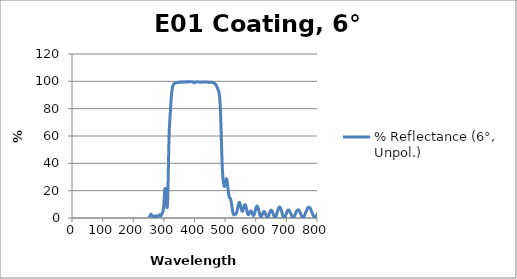
| Category | % Reflectance (6°, Unpol.) |
|---|---|
| 2500.0 | 4.356 |
| 2499.0 | 4.413 |
| 2498.0 | 4.459 |
| 2497.0 | 4.504 |
| 2496.0 | 4.55 |
| 2495.0 | 4.595 |
| 2494.0 | 4.642 |
| 2493.0 | 4.689 |
| 2492.0 | 4.738 |
| 2491.0 | 4.788 |
| 2490.0 | 4.834 |
| 2489.0 | 4.885 |
| 2488.0 | 4.934 |
| 2487.0 | 4.983 |
| 2486.0 | 5.035 |
| 2485.0 | 5.088 |
| 2484.0 | 5.137 |
| 2483.0 | 5.187 |
| 2482.0 | 5.238 |
| 2481.0 | 5.289 |
| 2480.0 | 5.342 |
| 2479.0 | 5.395 |
| 2478.0 | 5.446 |
| 2477.0 | 5.499 |
| 2476.0 | 5.551 |
| 2475.0 | 5.604 |
| 2474.0 | 5.654 |
| 2473.0 | 5.71 |
| 2472.0 | 5.762 |
| 2471.0 | 5.814 |
| 2470.0 | 5.866 |
| 2469.0 | 5.922 |
| 2468.0 | 5.971 |
| 2467.0 | 6.026 |
| 2466.0 | 6.08 |
| 2465.0 | 6.133 |
| 2464.0 | 6.186 |
| 2463.0 | 6.239 |
| 2462.0 | 6.29 |
| 2461.0 | 6.346 |
| 2460.0 | 6.398 |
| 2459.0 | 6.452 |
| 2458.0 | 6.504 |
| 2457.0 | 6.557 |
| 2456.0 | 6.61 |
| 2455.0 | 6.662 |
| 2454.0 | 6.715 |
| 2453.0 | 6.768 |
| 2452.0 | 6.82 |
| 2451.0 | 6.873 |
| 2450.0 | 6.924 |
| 2449.0 | 6.973 |
| 2448.0 | 7.027 |
| 2447.0 | 7.079 |
| 2446.0 | 7.127 |
| 2445.0 | 7.177 |
| 2444.0 | 7.227 |
| 2443.0 | 7.277 |
| 2442.0 | 7.328 |
| 2441.0 | 7.378 |
| 2440.0 | 7.425 |
| 2439.0 | 7.474 |
| 2438.0 | 7.521 |
| 2437.0 | 7.568 |
| 2436.0 | 7.616 |
| 2435.0 | 7.664 |
| 2434.0 | 7.709 |
| 2433.0 | 7.756 |
| 2432.0 | 7.8 |
| 2431.0 | 7.847 |
| 2430.0 | 7.888 |
| 2429.0 | 7.932 |
| 2428.0 | 7.976 |
| 2427.0 | 8.018 |
| 2426.0 | 8.061 |
| 2425.0 | 8.104 |
| 2424.0 | 8.142 |
| 2423.0 | 8.185 |
| 2422.0 | 8.225 |
| 2421.0 | 8.263 |
| 2420.0 | 8.305 |
| 2419.0 | 8.341 |
| 2418.0 | 8.378 |
| 2417.0 | 8.413 |
| 2416.0 | 8.451 |
| 2415.0 | 8.488 |
| 2414.0 | 8.519 |
| 2413.0 | 8.556 |
| 2412.0 | 8.587 |
| 2411.0 | 8.62 |
| 2410.0 | 8.652 |
| 2409.0 | 8.683 |
| 2408.0 | 8.712 |
| 2407.0 | 8.743 |
| 2406.0 | 8.771 |
| 2405.0 | 8.798 |
| 2404.0 | 8.824 |
| 2403.0 | 8.851 |
| 2402.0 | 8.877 |
| 2401.0 | 8.9 |
| 2400.0 | 8.922 |
| 2399.0 | 8.947 |
| 2398.0 | 8.969 |
| 2397.0 | 8.993 |
| 2396.0 | 9.01 |
| 2395.0 | 9.031 |
| 2394.0 | 9.047 |
| 2393.0 | 9.066 |
| 2392.0 | 9.081 |
| 2391.0 | 9.1 |
| 2390.0 | 9.111 |
| 2389.0 | 9.131 |
| 2388.0 | 9.137 |
| 2387.0 | 9.156 |
| 2386.0 | 9.166 |
| 2385.0 | 9.176 |
| 2384.0 | 9.185 |
| 2383.0 | 9.193 |
| 2382.0 | 9.202 |
| 2381.0 | 9.206 |
| 2380.0 | 9.213 |
| 2379.0 | 9.219 |
| 2378.0 | 9.222 |
| 2377.0 | 9.223 |
| 2376.0 | 9.226 |
| 2375.0 | 9.223 |
| 2374.0 | 9.227 |
| 2373.0 | 9.223 |
| 2372.0 | 9.221 |
| 2371.0 | 9.218 |
| 2370.0 | 9.213 |
| 2369.0 | 9.208 |
| 2368.0 | 9.203 |
| 2367.0 | 9.194 |
| 2366.0 | 9.187 |
| 2365.0 | 9.177 |
| 2364.0 | 9.17 |
| 2363.0 | 9.157 |
| 2362.0 | 9.145 |
| 2361.0 | 9.134 |
| 2360.0 | 9.119 |
| 2359.0 | 9.105 |
| 2358.0 | 9.086 |
| 2357.0 | 9.07 |
| 2356.0 | 9.051 |
| 2355.0 | 9.032 |
| 2354.0 | 9.012 |
| 2353.0 | 8.994 |
| 2352.0 | 8.967 |
| 2351.0 | 8.947 |
| 2350.0 | 8.921 |
| 2349.0 | 8.895 |
| 2348.0 | 8.872 |
| 2347.0 | 8.842 |
| 2346.0 | 8.813 |
| 2345.0 | 8.787 |
| 2344.0 | 8.756 |
| 2343.0 | 8.727 |
| 2342.0 | 8.695 |
| 2341.0 | 8.664 |
| 2340.0 | 8.631 |
| 2339.0 | 8.596 |
| 2338.0 | 8.562 |
| 2337.0 | 8.526 |
| 2336.0 | 8.49 |
| 2335.0 | 8.454 |
| 2334.0 | 8.416 |
| 2333.0 | 8.376 |
| 2332.0 | 8.339 |
| 2331.0 | 8.302 |
| 2330.0 | 8.256 |
| 2329.0 | 8.219 |
| 2328.0 | 8.174 |
| 2327.0 | 8.128 |
| 2326.0 | 8.083 |
| 2325.0 | 8.039 |
| 2324.0 | 7.993 |
| 2323.0 | 7.949 |
| 2322.0 | 7.899 |
| 2321.0 | 7.854 |
| 2320.0 | 7.802 |
| 2319.0 | 7.756 |
| 2318.0 | 7.705 |
| 2317.0 | 7.655 |
| 2316.0 | 7.607 |
| 2315.0 | 7.551 |
| 2314.0 | 7.501 |
| 2313.0 | 7.446 |
| 2312.0 | 7.394 |
| 2311.0 | 7.339 |
| 2310.0 | 7.287 |
| 2309.0 | 7.232 |
| 2308.0 | 7.175 |
| 2307.0 | 7.123 |
| 2306.0 | 7.065 |
| 2305.0 | 7.009 |
| 2304.0 | 6.954 |
| 2303.0 | 6.896 |
| 2302.0 | 6.838 |
| 2301.0 | 6.782 |
| 2300.0 | 6.724 |
| 2299.0 | 6.664 |
| 2298.0 | 6.608 |
| 2297.0 | 6.549 |
| 2296.0 | 6.488 |
| 2295.0 | 6.429 |
| 2294.0 | 6.368 |
| 2293.0 | 6.309 |
| 2292.0 | 6.248 |
| 2291.0 | 6.192 |
| 2290.0 | 6.129 |
| 2289.0 | 6.067 |
| 2288.0 | 6.008 |
| 2287.0 | 5.946 |
| 2286.0 | 5.885 |
| 2285.0 | 5.825 |
| 2284.0 | 5.764 |
| 2283.0 | 5.701 |
| 2282.0 | 5.641 |
| 2281.0 | 5.579 |
| 2280.0 | 5.515 |
| 2279.0 | 5.451 |
| 2278.0 | 5.387 |
| 2277.0 | 5.32 |
| 2276.0 | 5.254 |
| 2275.0 | 5.189 |
| 2274.0 | 5.124 |
| 2273.0 | 5.057 |
| 2272.0 | 4.995 |
| 2271.0 | 4.928 |
| 2270.0 | 4.861 |
| 2269.0 | 4.799 |
| 2268.0 | 4.733 |
| 2267.0 | 4.669 |
| 2266.0 | 4.608 |
| 2265.0 | 4.545 |
| 2264.0 | 4.484 |
| 2263.0 | 4.424 |
| 2262.0 | 4.365 |
| 2261.0 | 4.308 |
| 2260.0 | 4.253 |
| 2259.0 | 4.196 |
| 2258.0 | 4.141 |
| 2257.0 | 4.088 |
| 2256.0 | 4.036 |
| 2255.0 | 3.985 |
| 2254.0 | 3.934 |
| 2253.0 | 3.886 |
| 2252.0 | 3.835 |
| 2251.0 | 3.786 |
| 2250.0 | 3.741 |
| 2249.0 | 3.695 |
| 2248.0 | 3.65 |
| 2247.0 | 3.608 |
| 2246.0 | 3.564 |
| 2245.0 | 3.52 |
| 2244.0 | 3.482 |
| 2243.0 | 3.443 |
| 2242.0 | 3.402 |
| 2241.0 | 3.367 |
| 2240.0 | 3.33 |
| 2239.0 | 3.293 |
| 2238.0 | 3.262 |
| 2237.0 | 3.228 |
| 2236.0 | 3.197 |
| 2235.0 | 3.165 |
| 2234.0 | 3.136 |
| 2233.0 | 3.108 |
| 2232.0 | 3.079 |
| 2231.0 | 3.054 |
| 2230.0 | 3.028 |
| 2229.0 | 3.004 |
| 2228.0 | 2.981 |
| 2227.0 | 2.96 |
| 2226.0 | 2.939 |
| 2225.0 | 2.92 |
| 2224.0 | 2.902 |
| 2223.0 | 2.885 |
| 2222.0 | 2.871 |
| 2221.0 | 2.857 |
| 2220.0 | 2.844 |
| 2219.0 | 2.834 |
| 2218.0 | 2.824 |
| 2217.0 | 2.816 |
| 2216.0 | 2.809 |
| 2215.0 | 2.805 |
| 2214.0 | 2.801 |
| 2213.0 | 2.799 |
| 2212.0 | 2.798 |
| 2211.0 | 2.797 |
| 2210.0 | 2.802 |
| 2209.0 | 2.804 |
| 2208.0 | 2.81 |
| 2207.0 | 2.817 |
| 2206.0 | 2.826 |
| 2205.0 | 2.837 |
| 2204.0 | 2.849 |
| 2203.0 | 2.86 |
| 2202.0 | 2.877 |
| 2201.0 | 2.892 |
| 2200.0 | 2.91 |
| 2199.0 | 2.929 |
| 2198.0 | 2.949 |
| 2197.0 | 2.972 |
| 2196.0 | 2.994 |
| 2195.0 | 3.018 |
| 2194.0 | 3.045 |
| 2193.0 | 3.071 |
| 2192.0 | 3.099 |
| 2191.0 | 3.129 |
| 2190.0 | 3.159 |
| 2189.0 | 3.191 |
| 2188.0 | 3.225 |
| 2187.0 | 3.26 |
| 2186.0 | 3.296 |
| 2185.0 | 3.336 |
| 2184.0 | 3.373 |
| 2183.0 | 3.415 |
| 2182.0 | 3.457 |
| 2181.0 | 3.5 |
| 2180.0 | 3.542 |
| 2179.0 | 3.59 |
| 2178.0 | 3.636 |
| 2177.0 | 3.685 |
| 2176.0 | 3.736 |
| 2175.0 | 3.787 |
| 2174.0 | 3.837 |
| 2173.0 | 3.889 |
| 2172.0 | 3.941 |
| 2171.0 | 3.996 |
| 2170.0 | 4.052 |
| 2169.0 | 4.108 |
| 2168.0 | 4.164 |
| 2167.0 | 4.221 |
| 2166.0 | 4.281 |
| 2165.0 | 4.338 |
| 2164.0 | 4.401 |
| 2163.0 | 4.464 |
| 2162.0 | 4.524 |
| 2161.0 | 4.587 |
| 2160.0 | 4.65 |
| 2159.0 | 4.714 |
| 2158.0 | 4.78 |
| 2157.0 | 4.846 |
| 2156.0 | 4.911 |
| 2155.0 | 4.974 |
| 2154.0 | 5.043 |
| 2153.0 | 5.109 |
| 2152.0 | 5.173 |
| 2151.0 | 5.244 |
| 2150.0 | 5.312 |
| 2149.0 | 5.378 |
| 2148.0 | 5.45 |
| 2147.0 | 5.516 |
| 2146.0 | 5.582 |
| 2145.0 | 5.654 |
| 2144.0 | 5.727 |
| 2143.0 | 5.793 |
| 2142.0 | 5.862 |
| 2141.0 | 5.933 |
| 2140.0 | 6.002 |
| 2139.0 | 6.069 |
| 2138.0 | 6.142 |
| 2137.0 | 6.21 |
| 2136.0 | 6.279 |
| 2135.0 | 6.348 |
| 2134.0 | 6.417 |
| 2133.0 | 6.484 |
| 2132.0 | 6.555 |
| 2131.0 | 6.622 |
| 2130.0 | 6.69 |
| 2129.0 | 6.76 |
| 2128.0 | 6.826 |
| 2127.0 | 6.892 |
| 2126.0 | 6.96 |
| 2125.0 | 7.028 |
| 2124.0 | 7.091 |
| 2123.0 | 7.159 |
| 2122.0 | 7.223 |
| 2121.0 | 7.286 |
| 2120.0 | 7.349 |
| 2119.0 | 7.414 |
| 2118.0 | 7.475 |
| 2117.0 | 7.536 |
| 2116.0 | 7.598 |
| 2115.0 | 7.657 |
| 2114.0 | 7.715 |
| 2113.0 | 7.775 |
| 2112.0 | 7.832 |
| 2111.0 | 7.887 |
| 2110.0 | 7.943 |
| 2109.0 | 7.998 |
| 2108.0 | 8.053 |
| 2107.0 | 8.101 |
| 2106.0 | 8.157 |
| 2105.0 | 8.207 |
| 2104.0 | 8.255 |
| 2103.0 | 8.306 |
| 2102.0 | 8.351 |
| 2101.0 | 8.396 |
| 2100.0 | 8.444 |
| 2099.0 | 8.485 |
| 2098.0 | 8.527 |
| 2097.0 | 8.571 |
| 2096.0 | 8.608 |
| 2095.0 | 8.647 |
| 2094.0 | 8.685 |
| 2093.0 | 8.72 |
| 2092.0 | 8.757 |
| 2091.0 | 8.789 |
| 2090.0 | 8.82 |
| 2089.0 | 8.85 |
| 2088.0 | 8.881 |
| 2087.0 | 8.91 |
| 2086.0 | 8.935 |
| 2085.0 | 8.962 |
| 2084.0 | 8.987 |
| 2083.0 | 9.003 |
| 2082.0 | 9.027 |
| 2081.0 | 9.046 |
| 2080.0 | 9.058 |
| 2079.0 | 9.076 |
| 2078.0 | 9.092 |
| 2077.0 | 9.102 |
| 2076.0 | 9.114 |
| 2075.0 | 9.123 |
| 2074.0 | 9.131 |
| 2073.0 | 9.137 |
| 2072.0 | 9.141 |
| 2071.0 | 9.144 |
| 2070.0 | 9.147 |
| 2069.0 | 9.147 |
| 2068.0 | 9.145 |
| 2067.0 | 9.141 |
| 2066.0 | 9.138 |
| 2065.0 | 9.129 |
| 2064.0 | 9.122 |
| 2063.0 | 9.111 |
| 2062.0 | 9.103 |
| 2061.0 | 9.084 |
| 2060.0 | 9.074 |
| 2059.0 | 9.059 |
| 2058.0 | 9.037 |
| 2057.0 | 9.02 |
| 2056.0 | 9 |
| 2055.0 | 8.971 |
| 2054.0 | 8.952 |
| 2053.0 | 8.925 |
| 2052.0 | 8.897 |
| 2051.0 | 8.87 |
| 2050.0 | 8.84 |
| 2049.0 | 8.807 |
| 2048.0 | 8.774 |
| 2047.0 | 8.739 |
| 2046.0 | 8.7 |
| 2045.0 | 8.661 |
| 2044.0 | 8.623 |
| 2043.0 | 8.579 |
| 2042.0 | 8.538 |
| 2041.0 | 8.494 |
| 2040.0 | 8.448 |
| 2039.0 | 8.4 |
| 2038.0 | 8.351 |
| 2037.0 | 8.302 |
| 2036.0 | 8.248 |
| 2035.0 | 8.198 |
| 2034.0 | 8.142 |
| 2033.0 | 8.087 |
| 2032.0 | 8.033 |
| 2031.0 | 7.974 |
| 2030.0 | 7.914 |
| 2029.0 | 7.856 |
| 2028.0 | 7.793 |
| 2027.0 | 7.733 |
| 2026.0 | 7.67 |
| 2025.0 | 7.607 |
| 2024.0 | 7.54 |
| 2023.0 | 7.474 |
| 2022.0 | 7.407 |
| 2021.0 | 7.338 |
| 2020.0 | 7.27 |
| 2019.0 | 7.201 |
| 2018.0 | 7.131 |
| 2017.0 | 7.056 |
| 2016.0 | 6.984 |
| 2015.0 | 6.915 |
| 2014.0 | 6.837 |
| 2013.0 | 6.767 |
| 2012.0 | 6.694 |
| 2011.0 | 6.612 |
| 2010.0 | 6.541 |
| 2009.0 | 6.466 |
| 2008.0 | 6.385 |
| 2007.0 | 6.312 |
| 2006.0 | 6.234 |
| 2005.0 | 6.154 |
| 2004.0 | 6.079 |
| 2003.0 | 6.002 |
| 2002.0 | 5.923 |
| 2001.0 | 5.847 |
| 2000.0 | 5.77 |
| 1999.0 | 5.667 |
| 1998.0 | 5.592 |
| 1997.0 | 5.516 |
| 1996.0 | 5.438 |
| 1995.0 | 5.361 |
| 1994.0 | 5.288 |
| 1993.0 | 5.208 |
| 1992.0 | 5.132 |
| 1991.0 | 5.059 |
| 1990.0 | 4.984 |
| 1989.0 | 4.91 |
| 1988.0 | 4.839 |
| 1987.0 | 4.764 |
| 1986.0 | 4.692 |
| 1985.0 | 4.621 |
| 1984.0 | 4.553 |
| 1983.0 | 4.482 |
| 1982.0 | 4.414 |
| 1981.0 | 4.347 |
| 1980.0 | 4.28 |
| 1979.0 | 4.213 |
| 1978.0 | 4.151 |
| 1977.0 | 4.086 |
| 1976.0 | 4.026 |
| 1975.0 | 3.967 |
| 1974.0 | 3.907 |
| 1973.0 | 3.847 |
| 1972.0 | 3.792 |
| 1971.0 | 3.736 |
| 1970.0 | 3.683 |
| 1969.0 | 3.632 |
| 1968.0 | 3.581 |
| 1967.0 | 3.531 |
| 1966.0 | 3.486 |
| 1965.0 | 3.439 |
| 1964.0 | 3.398 |
| 1963.0 | 3.355 |
| 1962.0 | 3.317 |
| 1961.0 | 3.278 |
| 1960.0 | 3.243 |
| 1959.0 | 3.208 |
| 1958.0 | 3.175 |
| 1957.0 | 3.146 |
| 1956.0 | 3.119 |
| 1955.0 | 3.092 |
| 1954.0 | 3.068 |
| 1953.0 | 3.047 |
| 1952.0 | 3.028 |
| 1951.0 | 3.01 |
| 1950.0 | 2.995 |
| 1949.0 | 2.982 |
| 1948.0 | 2.972 |
| 1947.0 | 2.962 |
| 1946.0 | 2.956 |
| 1945.0 | 2.952 |
| 1944.0 | 2.951 |
| 1943.0 | 2.949 |
| 1942.0 | 2.952 |
| 1941.0 | 2.957 |
| 1940.0 | 2.964 |
| 1939.0 | 2.974 |
| 1938.0 | 2.984 |
| 1937.0 | 2.997 |
| 1936.0 | 3.014 |
| 1935.0 | 3.034 |
| 1934.0 | 3.052 |
| 1933.0 | 3.076 |
| 1932.0 | 3.1 |
| 1931.0 | 3.127 |
| 1930.0 | 3.156 |
| 1929.0 | 3.187 |
| 1928.0 | 3.222 |
| 1927.0 | 3.257 |
| 1926.0 | 3.293 |
| 1925.0 | 3.332 |
| 1924.0 | 3.374 |
| 1923.0 | 3.418 |
| 1922.0 | 3.463 |
| 1921.0 | 3.512 |
| 1920.0 | 3.561 |
| 1919.0 | 3.613 |
| 1918.0 | 3.665 |
| 1917.0 | 3.722 |
| 1916.0 | 3.775 |
| 1915.0 | 3.833 |
| 1914.0 | 3.892 |
| 1913.0 | 3.951 |
| 1912.0 | 4.013 |
| 1911.0 | 4.078 |
| 1910.0 | 4.144 |
| 1909.0 | 4.206 |
| 1908.0 | 4.27 |
| 1907.0 | 4.342 |
| 1906.0 | 4.41 |
| 1905.0 | 4.483 |
| 1904.0 | 4.559 |
| 1903.0 | 4.634 |
| 1902.0 | 4.707 |
| 1901.0 | 4.786 |
| 1900.0 | 4.859 |
| 1899.0 | 4.938 |
| 1898.0 | 5.016 |
| 1897.0 | 5.094 |
| 1896.0 | 5.169 |
| 1895.0 | 5.249 |
| 1894.0 | 5.329 |
| 1893.0 | 5.402 |
| 1892.0 | 5.486 |
| 1891.0 | 5.566 |
| 1890.0 | 5.643 |
| 1889.0 | 5.724 |
| 1888.0 | 5.805 |
| 1887.0 | 5.883 |
| 1886.0 | 5.963 |
| 1885.0 | 6.048 |
| 1884.0 | 6.124 |
| 1883.0 | 6.203 |
| 1882.0 | 6.28 |
| 1881.0 | 6.357 |
| 1880.0 | 6.432 |
| 1879.0 | 6.509 |
| 1878.0 | 6.585 |
| 1877.0 | 6.658 |
| 1876.0 | 6.74 |
| 1875.0 | 6.814 |
| 1874.0 | 6.892 |
| 1873.0 | 6.969 |
| 1872.0 | 7.047 |
| 1871.0 | 7.124 |
| 1870.0 | 7.197 |
| 1869.0 | 7.273 |
| 1868.0 | 7.341 |
| 1867.0 | 7.41 |
| 1866.0 | 7.48 |
| 1865.0 | 7.54 |
| 1864.0 | 7.6 |
| 1863.0 | 7.66 |
| 1862.0 | 7.713 |
| 1861.0 | 7.768 |
| 1860.0 | 7.822 |
| 1859.0 | 7.875 |
| 1858.0 | 7.924 |
| 1857.0 | 7.975 |
| 1856.0 | 8.022 |
| 1855.0 | 8.067 |
| 1854.0 | 8.111 |
| 1853.0 | 8.155 |
| 1852.0 | 8.194 |
| 1851.0 | 8.235 |
| 1850.0 | 8.27 |
| 1849.0 | 8.302 |
| 1848.0 | 8.333 |
| 1847.0 | 8.366 |
| 1846.0 | 8.388 |
| 1845.0 | 8.413 |
| 1844.0 | 8.434 |
| 1843.0 | 8.454 |
| 1842.0 | 8.471 |
| 1841.0 | 8.486 |
| 1840.0 | 8.499 |
| 1839.0 | 8.507 |
| 1838.0 | 8.514 |
| 1837.0 | 8.522 |
| 1836.0 | 8.521 |
| 1835.0 | 8.523 |
| 1834.0 | 8.518 |
| 1833.0 | 8.514 |
| 1832.0 | 8.505 |
| 1831.0 | 8.497 |
| 1830.0 | 8.482 |
| 1829.0 | 8.47 |
| 1828.0 | 8.451 |
| 1827.0 | 8.433 |
| 1826.0 | 8.407 |
| 1825.0 | 8.382 |
| 1824.0 | 8.355 |
| 1823.0 | 8.323 |
| 1822.0 | 8.288 |
| 1821.0 | 8.258 |
| 1820.0 | 8.215 |
| 1819.0 | 8.177 |
| 1818.0 | 8.131 |
| 1817.0 | 8.088 |
| 1816.0 | 8.038 |
| 1815.0 | 7.987 |
| 1814.0 | 7.937 |
| 1813.0 | 7.882 |
| 1812.0 | 7.825 |
| 1811.0 | 7.767 |
| 1810.0 | 7.707 |
| 1809.0 | 7.639 |
| 1808.0 | 7.576 |
| 1807.0 | 7.509 |
| 1806.0 | 7.44 |
| 1805.0 | 7.371 |
| 1804.0 | 7.294 |
| 1803.0 | 7.218 |
| 1802.0 | 7.144 |
| 1801.0 | 7.065 |
| 1800.0 | 6.983 |
| 1799.0 | 6.902 |
| 1798.0 | 6.817 |
| 1797.0 | 6.731 |
| 1796.0 | 6.643 |
| 1795.0 | 6.558 |
| 1794.0 | 6.468 |
| 1793.0 | 6.38 |
| 1792.0 | 6.289 |
| 1791.0 | 6.197 |
| 1790.0 | 6.1 |
| 1789.0 | 6.009 |
| 1788.0 | 5.915 |
| 1787.0 | 5.818 |
| 1786.0 | 5.723 |
| 1785.0 | 5.625 |
| 1784.0 | 5.525 |
| 1783.0 | 5.431 |
| 1782.0 | 5.333 |
| 1781.0 | 5.236 |
| 1780.0 | 5.139 |
| 1779.0 | 5.044 |
| 1778.0 | 4.943 |
| 1777.0 | 4.846 |
| 1776.0 | 4.751 |
| 1775.0 | 4.654 |
| 1774.0 | 4.556 |
| 1773.0 | 4.468 |
| 1772.0 | 4.369 |
| 1771.0 | 4.277 |
| 1770.0 | 4.186 |
| 1769.0 | 4.093 |
| 1768.0 | 4.005 |
| 1767.0 | 3.918 |
| 1766.0 | 3.828 |
| 1765.0 | 3.742 |
| 1764.0 | 3.661 |
| 1763.0 | 3.577 |
| 1762.0 | 3.498 |
| 1761.0 | 3.422 |
| 1760.0 | 3.347 |
| 1759.0 | 3.271 |
| 1758.0 | 3.201 |
| 1757.0 | 3.133 |
| 1756.0 | 3.066 |
| 1755.0 | 3.001 |
| 1754.0 | 2.942 |
| 1753.0 | 2.883 |
| 1752.0 | 2.827 |
| 1751.0 | 2.776 |
| 1750.0 | 2.725 |
| 1749.0 | 2.679 |
| 1748.0 | 2.637 |
| 1747.0 | 2.596 |
| 1746.0 | 2.559 |
| 1745.0 | 2.527 |
| 1744.0 | 2.496 |
| 1743.0 | 2.467 |
| 1742.0 | 2.448 |
| 1741.0 | 2.425 |
| 1740.0 | 2.41 |
| 1739.0 | 2.397 |
| 1738.0 | 2.388 |
| 1737.0 | 2.384 |
| 1736.0 | 2.381 |
| 1735.0 | 2.385 |
| 1734.0 | 2.39 |
| 1733.0 | 2.402 |
| 1732.0 | 2.415 |
| 1731.0 | 2.431 |
| 1730.0 | 2.454 |
| 1729.0 | 2.477 |
| 1728.0 | 2.505 |
| 1727.0 | 2.539 |
| 1726.0 | 2.574 |
| 1725.0 | 2.614 |
| 1724.0 | 2.657 |
| 1723.0 | 2.702 |
| 1722.0 | 2.755 |
| 1721.0 | 2.808 |
| 1720.0 | 2.865 |
| 1719.0 | 2.923 |
| 1718.0 | 2.989 |
| 1717.0 | 3.055 |
| 1716.0 | 3.122 |
| 1715.0 | 3.196 |
| 1714.0 | 3.275 |
| 1713.0 | 3.349 |
| 1712.0 | 3.433 |
| 1711.0 | 3.516 |
| 1710.0 | 3.602 |
| 1709.0 | 3.692 |
| 1708.0 | 3.787 |
| 1707.0 | 3.878 |
| 1706.0 | 3.974 |
| 1705.0 | 4.073 |
| 1704.0 | 4.168 |
| 1703.0 | 4.269 |
| 1702.0 | 4.378 |
| 1701.0 | 4.479 |
| 1700.0 | 4.585 |
| 1699.0 | 4.694 |
| 1698.0 | 4.802 |
| 1697.0 | 4.907 |
| 1696.0 | 5.024 |
| 1695.0 | 5.136 |
| 1694.0 | 5.244 |
| 1693.0 | 5.362 |
| 1692.0 | 5.47 |
| 1691.0 | 5.582 |
| 1690.0 | 5.7 |
| 1689.0 | 5.812 |
| 1688.0 | 5.922 |
| 1687.0 | 6.037 |
| 1686.0 | 6.146 |
| 1685.0 | 6.258 |
| 1684.0 | 6.369 |
| 1683.0 | 6.481 |
| 1682.0 | 6.59 |
| 1681.0 | 6.697 |
| 1680.0 | 6.803 |
| 1679.0 | 6.907 |
| 1678.0 | 7.013 |
| 1677.0 | 7.118 |
| 1676.0 | 7.217 |
| 1675.0 | 7.313 |
| 1674.0 | 7.411 |
| 1673.0 | 7.505 |
| 1672.0 | 7.593 |
| 1671.0 | 7.687 |
| 1670.0 | 7.774 |
| 1669.0 | 7.861 |
| 1668.0 | 7.936 |
| 1667.0 | 8.017 |
| 1666.0 | 8.095 |
| 1665.0 | 8.163 |
| 1664.0 | 8.239 |
| 1663.0 | 8.305 |
| 1662.0 | 8.366 |
| 1661.0 | 8.429 |
| 1660.0 | 8.487 |
| 1659.0 | 8.535 |
| 1658.0 | 8.59 |
| 1657.0 | 8.637 |
| 1656.0 | 8.674 |
| 1655.0 | 8.715 |
| 1654.0 | 8.753 |
| 1653.0 | 8.781 |
| 1652.0 | 8.811 |
| 1651.0 | 8.835 |
| 1650.0 | 8.853 |
| 1649.0 | 8.871 |
| 1648.0 | 8.881 |
| 1647.0 | 8.89 |
| 1646.0 | 8.892 |
| 1645.0 | 8.893 |
| 1644.0 | 8.891 |
| 1643.0 | 8.881 |
| 1642.0 | 8.865 |
| 1641.0 | 8.851 |
| 1640.0 | 8.83 |
| 1639.0 | 8.8 |
| 1638.0 | 8.774 |
| 1637.0 | 8.743 |
| 1636.0 | 8.704 |
| 1635.0 | 8.66 |
| 1634.0 | 8.618 |
| 1633.0 | 8.566 |
| 1632.0 | 8.511 |
| 1631.0 | 8.457 |
| 1630.0 | 8.395 |
| 1629.0 | 8.33 |
| 1628.0 | 8.264 |
| 1627.0 | 8.19 |
| 1626.0 | 8.111 |
| 1625.0 | 8.033 |
| 1624.0 | 7.952 |
| 1623.0 | 7.866 |
| 1622.0 | 7.778 |
| 1621.0 | 7.686 |
| 1620.0 | 7.589 |
| 1619.0 | 7.495 |
| 1618.0 | 7.391 |
| 1617.0 | 7.287 |
| 1616.0 | 7.186 |
| 1615.0 | 7.076 |
| 1614.0 | 6.963 |
| 1613.0 | 6.853 |
| 1612.0 | 6.738 |
| 1611.0 | 6.619 |
| 1610.0 | 6.501 |
| 1609.0 | 6.384 |
| 1608.0 | 6.257 |
| 1607.0 | 6.135 |
| 1606.0 | 6.012 |
| 1605.0 | 5.886 |
| 1604.0 | 5.762 |
| 1603.0 | 5.639 |
| 1602.0 | 5.512 |
| 1601.0 | 5.383 |
| 1600.0 | 5.258 |
| 1599.0 | 5.133 |
| 1598.0 | 5.006 |
| 1597.0 | 4.885 |
| 1596.0 | 4.763 |
| 1595.0 | 4.635 |
| 1594.0 | 4.515 |
| 1593.0 | 4.398 |
| 1592.0 | 4.278 |
| 1591.0 | 4.162 |
| 1590.0 | 4.051 |
| 1589.0 | 3.934 |
| 1588.0 | 3.822 |
| 1587.0 | 3.721 |
| 1586.0 | 3.614 |
| 1585.0 | 3.514 |
| 1584.0 | 3.42 |
| 1583.0 | 3.322 |
| 1582.0 | 3.232 |
| 1581.0 | 3.146 |
| 1580.0 | 3.063 |
| 1579.0 | 2.983 |
| 1578.0 | 2.911 |
| 1577.0 | 2.843 |
| 1576.0 | 2.776 |
| 1575.0 | 2.716 |
| 1574.0 | 2.662 |
| 1573.0 | 2.611 |
| 1572.0 | 2.565 |
| 1571.0 | 2.528 |
| 1570.0 | 2.493 |
| 1569.0 | 2.463 |
| 1568.0 | 2.441 |
| 1567.0 | 2.423 |
| 1566.0 | 2.409 |
| 1565.0 | 2.403 |
| 1564.0 | 2.404 |
| 1563.0 | 2.406 |
| 1562.0 | 2.416 |
| 1561.0 | 2.433 |
| 1560.0 | 2.455 |
| 1559.0 | 2.481 |
| 1558.0 | 2.515 |
| 1557.0 | 2.555 |
| 1556.0 | 2.597 |
| 1555.0 | 2.647 |
| 1554.0 | 2.704 |
| 1553.0 | 2.762 |
| 1552.0 | 2.827 |
| 1551.0 | 2.899 |
| 1550.0 | 2.975 |
| 1549.0 | 3.05 |
| 1548.0 | 3.139 |
| 1547.0 | 3.229 |
| 1546.0 | 3.318 |
| 1545.0 | 3.416 |
| 1544.0 | 3.521 |
| 1543.0 | 3.626 |
| 1542.0 | 3.732 |
| 1541.0 | 3.845 |
| 1540.0 | 3.958 |
| 1539.0 | 4.076 |
| 1538.0 | 4.201 |
| 1537.0 | 4.323 |
| 1536.0 | 4.446 |
| 1535.0 | 4.576 |
| 1534.0 | 4.705 |
| 1533.0 | 4.834 |
| 1532.0 | 4.967 |
| 1531.0 | 5.102 |
| 1530.0 | 5.231 |
| 1529.0 | 5.372 |
| 1528.0 | 5.504 |
| 1527.0 | 5.636 |
| 1526.0 | 5.774 |
| 1525.0 | 5.912 |
| 1524.0 | 6.041 |
| 1523.0 | 6.174 |
| 1522.0 | 6.307 |
| 1521.0 | 6.431 |
| 1520.0 | 6.559 |
| 1519.0 | 6.69 |
| 1518.0 | 6.815 |
| 1517.0 | 6.932 |
| 1516.0 | 7.054 |
| 1515.0 | 7.17 |
| 1514.0 | 7.279 |
| 1513.0 | 7.391 |
| 1512.0 | 7.5 |
| 1511.0 | 7.6 |
| 1510.0 | 7.7 |
| 1509.0 | 7.796 |
| 1508.0 | 7.884 |
| 1507.0 | 7.971 |
| 1506.0 | 8.053 |
| 1505.0 | 8.128 |
| 1504.0 | 8.2 |
| 1503.0 | 8.266 |
| 1502.0 | 8.326 |
| 1501.0 | 8.385 |
| 1500.0 | 8.438 |
| 1499.0 | 8.482 |
| 1498.0 | 8.52 |
| 1497.0 | 8.556 |
| 1496.0 | 8.588 |
| 1495.0 | 8.605 |
| 1494.0 | 8.622 |
| 1493.0 | 8.635 |
| 1492.0 | 8.642 |
| 1491.0 | 8.644 |
| 1490.0 | 8.633 |
| 1489.0 | 8.621 |
| 1488.0 | 8.601 |
| 1487.0 | 8.574 |
| 1486.0 | 8.548 |
| 1485.0 | 8.507 |
| 1484.0 | 8.463 |
| 1483.0 | 8.414 |
| 1482.0 | 8.36 |
| 1481.0 | 8.297 |
| 1480.0 | 8.231 |
| 1479.0 | 8.163 |
| 1478.0 | 8.086 |
| 1477.0 | 8 |
| 1476.0 | 7.914 |
| 1475.0 | 7.817 |
| 1474.0 | 7.72 |
| 1473.0 | 7.623 |
| 1472.0 | 7.514 |
| 1471.0 | 7.399 |
| 1470.0 | 7.286 |
| 1469.0 | 7.163 |
| 1468.0 | 7.031 |
| 1467.0 | 6.917 |
| 1466.0 | 6.782 |
| 1465.0 | 6.644 |
| 1464.0 | 6.512 |
| 1463.0 | 6.371 |
| 1462.0 | 6.225 |
| 1461.0 | 6.083 |
| 1460.0 | 5.939 |
| 1459.0 | 5.792 |
| 1458.0 | 5.645 |
| 1457.0 | 5.499 |
| 1456.0 | 5.347 |
| 1455.0 | 5.195 |
| 1454.0 | 5.052 |
| 1453.0 | 4.899 |
| 1452.0 | 4.751 |
| 1451.0 | 4.61 |
| 1450.0 | 4.46 |
| 1449.0 | 4.315 |
| 1448.0 | 4.178 |
| 1447.0 | 4.04 |
| 1446.0 | 3.903 |
| 1445.0 | 3.775 |
| 1444.0 | 3.647 |
| 1443.0 | 3.518 |
| 1442.0 | 3.402 |
| 1441.0 | 3.288 |
| 1440.0 | 3.177 |
| 1439.0 | 3.076 |
| 1438.0 | 2.979 |
| 1437.0 | 2.883 |
| 1436.0 | 2.797 |
| 1435.0 | 2.721 |
| 1434.0 | 2.647 |
| 1433.0 | 2.582 |
| 1432.0 | 2.525 |
| 1431.0 | 2.474 |
| 1430.0 | 2.429 |
| 1429.0 | 2.395 |
| 1428.0 | 2.368 |
| 1427.0 | 2.348 |
| 1426.0 | 2.339 |
| 1425.0 | 2.336 |
| 1424.0 | 2.342 |
| 1423.0 | 2.354 |
| 1422.0 | 2.377 |
| 1421.0 | 2.409 |
| 1420.0 | 2.447 |
| 1419.0 | 2.493 |
| 1418.0 | 2.549 |
| 1417.0 | 2.611 |
| 1416.0 | 2.682 |
| 1415.0 | 2.761 |
| 1414.0 | 2.843 |
| 1413.0 | 2.936 |
| 1412.0 | 3.037 |
| 1411.0 | 3.146 |
| 1410.0 | 3.255 |
| 1409.0 | 3.374 |
| 1408.0 | 3.5 |
| 1407.0 | 3.628 |
| 1406.0 | 3.765 |
| 1405.0 | 3.909 |
| 1404.0 | 4.048 |
| 1403.0 | 4.198 |
| 1402.0 | 4.346 |
| 1401.0 | 4.499 |
| 1400.0 | 4.657 |
| 1399.0 | 4.82 |
| 1398.0 | 4.98 |
| 1397.0 | 5.138 |
| 1396.0 | 5.309 |
| 1395.0 | 5.477 |
| 1394.0 | 5.638 |
| 1393.0 | 5.81 |
| 1392.0 | 5.975 |
| 1391.0 | 6.135 |
| 1390.0 | 6.294 |
| 1389.0 | 6.451 |
| 1388.0 | 6.597 |
| 1387.0 | 6.75 |
| 1386.0 | 6.904 |
| 1385.0 | 7.046 |
| 1384.0 | 7.193 |
| 1383.0 | 7.34 |
| 1382.0 | 7.474 |
| 1381.0 | 7.612 |
| 1380.0 | 7.744 |
| 1379.0 | 7.862 |
| 1378.0 | 7.973 |
| 1377.0 | 8.079 |
| 1376.0 | 8.176 |
| 1375.0 | 8.263 |
| 1374.0 | 8.347 |
| 1373.0 | 8.424 |
| 1372.0 | 8.492 |
| 1371.0 | 8.554 |
| 1370.0 | 8.609 |
| 1369.0 | 8.653 |
| 1368.0 | 8.692 |
| 1367.0 | 8.723 |
| 1366.0 | 8.742 |
| 1365.0 | 8.752 |
| 1364.0 | 8.757 |
| 1363.0 | 8.748 |
| 1362.0 | 8.734 |
| 1361.0 | 8.706 |
| 1360.0 | 8.673 |
| 1359.0 | 8.632 |
| 1358.0 | 8.58 |
| 1357.0 | 8.522 |
| 1356.0 | 8.453 |
| 1355.0 | 8.376 |
| 1354.0 | 8.29 |
| 1353.0 | 8.199 |
| 1352.0 | 8.1 |
| 1351.0 | 7.987 |
| 1350.0 | 7.877 |
| 1349.0 | 7.752 |
| 1348.0 | 7.621 |
| 1347.0 | 7.486 |
| 1346.0 | 7.34 |
| 1345.0 | 7.192 |
| 1344.0 | 7.04 |
| 1343.0 | 6.881 |
| 1342.0 | 6.709 |
| 1341.0 | 6.539 |
| 1340.0 | 6.37 |
| 1339.0 | 6.192 |
| 1338.0 | 6.011 |
| 1337.0 | 5.833 |
| 1336.0 | 5.64 |
| 1335.0 | 5.454 |
| 1334.0 | 5.272 |
| 1333.0 | 5.081 |
| 1332.0 | 4.893 |
| 1331.0 | 4.713 |
| 1330.0 | 4.522 |
| 1329.0 | 4.337 |
| 1328.0 | 4.163 |
| 1327.0 | 3.984 |
| 1326.0 | 3.811 |
| 1325.0 | 3.649 |
| 1324.0 | 3.485 |
| 1323.0 | 3.325 |
| 1322.0 | 3.179 |
| 1321.0 | 3.038 |
| 1320.0 | 2.899 |
| 1319.0 | 2.776 |
| 1318.0 | 2.659 |
| 1317.0 | 2.546 |
| 1316.0 | 2.448 |
| 1315.0 | 2.36 |
| 1314.0 | 2.282 |
| 1313.0 | 2.213 |
| 1312.0 | 2.158 |
| 1311.0 | 2.112 |
| 1310.0 | 2.077 |
| 1309.0 | 2.056 |
| 1308.0 | 2.046 |
| 1307.0 | 2.048 |
| 1306.0 | 2.061 |
| 1305.0 | 2.088 |
| 1304.0 | 2.126 |
| 1303.0 | 2.176 |
| 1302.0 | 2.236 |
| 1301.0 | 2.31 |
| 1300.0 | 2.393 |
| 1299.0 | 2.488 |
| 1298.0 | 2.597 |
| 1297.0 | 2.712 |
| 1296.0 | 2.836 |
| 1295.0 | 2.972 |
| 1294.0 | 3.115 |
| 1293.0 | 3.263 |
| 1292.0 | 3.424 |
| 1291.0 | 3.596 |
| 1290.0 | 3.761 |
| 1289.0 | 3.943 |
| 1288.0 | 4.128 |
| 1287.0 | 4.307 |
| 1286.0 | 4.503 |
| 1285.0 | 4.699 |
| 1284.0 | 4.892 |
| 1283.0 | 5.088 |
| 1282.0 | 5.288 |
| 1281.0 | 5.482 |
| 1280.0 | 5.678 |
| 1279.0 | 5.88 |
| 1278.0 | 6.069 |
| 1277.0 | 6.259 |
| 1276.0 | 6.445 |
| 1275.0 | 6.626 |
| 1274.0 | 6.799 |
| 1273.0 | 6.976 |
| 1272.0 | 7.145 |
| 1271.0 | 7.296 |
| 1270.0 | 7.445 |
| 1269.0 | 7.594 |
| 1268.0 | 7.723 |
| 1267.0 | 7.852 |
| 1266.0 | 7.97 |
| 1265.0 | 8.072 |
| 1264.0 | 8.169 |
| 1263.0 | 8.255 |
| 1262.0 | 8.325 |
| 1261.0 | 8.388 |
| 1260.0 | 8.446 |
| 1259.0 | 8.487 |
| 1258.0 | 8.508 |
| 1257.0 | 8.524 |
| 1256.0 | 8.526 |
| 1255.0 | 8.514 |
| 1254.0 | 8.498 |
| 1253.0 | 8.465 |
| 1252.0 | 8.424 |
| 1251.0 | 8.363 |
| 1250.0 | 8.289 |
| 1249.0 | 8.209 |
| 1248.0 | 8.113 |
| 1247.0 | 7.998 |
| 1246.0 | 7.894 |
| 1245.0 | 7.768 |
| 1244.0 | 7.626 |
| 1243.0 | 7.479 |
| 1242.0 | 7.323 |
| 1241.0 | 7.151 |
| 1240.0 | 6.977 |
| 1239.0 | 6.796 |
| 1238.0 | 6.606 |
| 1237.0 | 6.41 |
| 1236.0 | 6.211 |
| 1235.0 | 6.001 |
| 1234.0 | 5.785 |
| 1233.0 | 5.578 |
| 1232.0 | 5.359 |
| 1231.0 | 5.137 |
| 1230.0 | 4.926 |
| 1229.0 | 4.701 |
| 1228.0 | 4.482 |
| 1227.0 | 4.268 |
| 1226.0 | 4.056 |
| 1225.0 | 3.848 |
| 1224.0 | 3.649 |
| 1223.0 | 3.45 |
| 1222.0 | 3.256 |
| 1221.0 | 3.08 |
| 1220.0 | 2.907 |
| 1219.0 | 2.743 |
| 1218.0 | 2.594 |
| 1217.0 | 2.457 |
| 1216.0 | 2.326 |
| 1215.0 | 2.21 |
| 1214.0 | 2.113 |
| 1213.0 | 2.025 |
| 1212.0 | 1.954 |
| 1211.0 | 1.899 |
| 1210.0 | 1.856 |
| 1209.0 | 1.832 |
| 1208.0 | 1.823 |
| 1207.0 | 1.829 |
| 1206.0 | 1.854 |
| 1205.0 | 1.891 |
| 1204.0 | 1.946 |
| 1203.0 | 2.021 |
| 1202.0 | 2.103 |
| 1201.0 | 2.203 |
| 1200.0 | 2.317 |
| 1199.0 | 2.446 |
| 1198.0 | 2.58 |
| 1197.0 | 2.734 |
| 1196.0 | 2.902 |
| 1195.0 | 3.066 |
| 1194.0 | 3.254 |
| 1193.0 | 3.445 |
| 1192.0 | 3.635 |
| 1191.0 | 3.845 |
| 1190.0 | 4.058 |
| 1189.0 | 4.267 |
| 1188.0 | 4.483 |
| 1187.0 | 4.702 |
| 1186.0 | 4.914 |
| 1185.0 | 5.137 |
| 1184.0 | 5.361 |
| 1183.0 | 5.568 |
| 1182.0 | 5.772 |
| 1181.0 | 5.982 |
| 1180.0 | 6.179 |
| 1179.0 | 6.368 |
| 1178.0 | 6.555 |
| 1177.0 | 6.729 |
| 1176.0 | 6.89 |
| 1175.0 | 7.046 |
| 1174.0 | 7.188 |
| 1173.0 | 7.313 |
| 1172.0 | 7.431 |
| 1171.0 | 7.535 |
| 1170.0 | 7.622 |
| 1169.0 | 7.696 |
| 1168.0 | 7.755 |
| 1167.0 | 7.797 |
| 1166.0 | 7.826 |
| 1165.0 | 7.838 |
| 1164.0 | 7.833 |
| 1163.0 | 7.815 |
| 1162.0 | 7.781 |
| 1161.0 | 7.717 |
| 1160.0 | 7.655 |
| 1159.0 | 7.569 |
| 1158.0 | 7.469 |
| 1157.0 | 7.353 |
| 1156.0 | 7.224 |
| 1155.0 | 7.081 |
| 1154.0 | 6.929 |
| 1153.0 | 6.753 |
| 1152.0 | 6.571 |
| 1151.0 | 6.383 |
| 1150.0 | 6.176 |
| 1149.0 | 5.965 |
| 1148.0 | 5.753 |
| 1147.0 | 5.523 |
| 1146.0 | 5.284 |
| 1145.0 | 5.057 |
| 1144.0 | 4.817 |
| 1143.0 | 4.577 |
| 1142.0 | 4.342 |
| 1141.0 | 4.106 |
| 1140.0 | 3.868 |
| 1139.0 | 3.639 |
| 1138.0 | 3.425 |
| 1137.0 | 3.203 |
| 1136.0 | 2.999 |
| 1135.0 | 2.809 |
| 1134.0 | 2.618 |
| 1133.0 | 2.45 |
| 1132.0 | 2.299 |
| 1131.0 | 2.161 |
| 1130.0 | 2.04 |
| 1129.0 | 1.94 |
| 1128.0 | 1.855 |
| 1127.0 | 1.792 |
| 1126.0 | 1.75 |
| 1125.0 | 1.729 |
| 1124.0 | 1.731 |
| 1123.0 | 1.752 |
| 1122.0 | 1.796 |
| 1121.0 | 1.863 |
| 1120.0 | 1.949 |
| 1119.0 | 2.054 |
| 1118.0 | 2.184 |
| 1117.0 | 2.33 |
| 1116.0 | 2.491 |
| 1115.0 | 2.68 |
| 1114.0 | 2.881 |
| 1113.0 | 3.089 |
| 1112.0 | 3.316 |
| 1111.0 | 3.559 |
| 1110.0 | 3.796 |
| 1109.0 | 4.061 |
| 1108.0 | 4.333 |
| 1107.0 | 4.593 |
| 1106.0 | 4.871 |
| 1105.0 | 5.147 |
| 1104.0 | 5.415 |
| 1103.0 | 5.689 |
| 1102.0 | 5.966 |
| 1101.0 | 6.227 |
| 1100.0 | 6.48 |
| 1099.0 | 6.73 |
| 1098.0 | 6.967 |
| 1097.0 | 7.189 |
| 1096.0 | 7.407 |
| 1095.0 | 7.604 |
| 1094.0 | 7.781 |
| 1093.0 | 7.946 |
| 1092.0 | 8.096 |
| 1091.0 | 8.218 |
| 1090.0 | 8.331 |
| 1089.0 | 8.42 |
| 1088.0 | 8.482 |
| 1087.0 | 8.527 |
| 1086.0 | 8.55 |
| 1085.0 | 8.547 |
| 1084.0 | 8.527 |
| 1083.0 | 8.477 |
| 1082.0 | 8.411 |
| 1081.0 | 8.32 |
| 1080.0 | 8.206 |
| 1079.0 | 8.074 |
| 1078.0 | 7.919 |
| 1077.0 | 7.744 |
| 1076.0 | 7.552 |
| 1075.0 | 7.347 |
| 1074.0 | 7.117 |
| 1073.0 | 6.874 |
| 1072.0 | 6.627 |
| 1071.0 | 6.351 |
| 1070.0 | 6.066 |
| 1069.0 | 5.792 |
| 1068.0 | 5.495 |
| 1067.0 | 5.196 |
| 1066.0 | 4.907 |
| 1065.0 | 4.604 |
| 1064.0 | 4.302 |
| 1063.0 | 4.018 |
| 1062.0 | 3.738 |
| 1061.0 | 3.462 |
| 1060.0 | 3.205 |
| 1059.0 | 2.962 |
| 1058.0 | 2.724 |
| 1057.0 | 2.514 |
| 1056.0 | 2.325 |
| 1055.0 | 2.151 |
| 1054.0 | 2.003 |
| 1053.0 | 1.881 |
| 1052.0 | 1.781 |
| 1051.0 | 1.707 |
| 1050.0 | 1.661 |
| 1049.0 | 1.403 |
| 1048.0 | 1.424 |
| 1047.0 | 1.472 |
| 1046.0 | 1.554 |
| 1045.0 | 1.666 |
| 1044.0 | 1.801 |
| 1043.0 | 1.964 |
| 1042.0 | 2.156 |
| 1041.0 | 2.363 |
| 1040.0 | 2.594 |
| 1039.0 | 2.855 |
| 1038.0 | 3.122 |
| 1037.0 | 3.4 |
| 1036.0 | 3.696 |
| 1035.0 | 3.998 |
| 1034.0 | 4.298 |
| 1033.0 | 4.617 |
| 1032.0 | 4.935 |
| 1031.0 | 5.231 |
| 1030.0 | 5.54 |
| 1029.0 | 5.835 |
| 1028.0 | 6.11 |
| 1027.0 | 6.389 |
| 1026.0 | 6.648 |
| 1025.0 | 6.882 |
| 1024.0 | 7.101 |
| 1023.0 | 7.302 |
| 1022.0 | 7.471 |
| 1021.0 | 7.623 |
| 1020.0 | 7.752 |
| 1019.0 | 7.848 |
| 1018.0 | 7.916 |
| 1017.0 | 7.959 |
| 1016.0 | 7.972 |
| 1015.0 | 7.955 |
| 1014.0 | 7.91 |
| 1013.0 | 7.834 |
| 1012.0 | 7.734 |
| 1011.0 | 7.601 |
| 1010.0 | 7.442 |
| 1009.0 | 7.265 |
| 1008.0 | 7.053 |
| 1007.0 | 6.818 |
| 1006.0 | 6.573 |
| 1005.0 | 6.3 |
| 1004.0 | 6.008 |
| 1003.0 | 5.716 |
| 1002.0 | 5.402 |
| 1001.0 | 5.074 |
| 1000.0 | 4.749 |
| 999.0 | 4.425 |
| 998.0 | 4.093 |
| 997.0 | 3.771 |
| 996.0 | 3.463 |
| 995.0 | 3.151 |
| 994.0 | 2.858 |
| 993.0 | 2.597 |
| 992.0 | 2.345 |
| 991.0 | 2.119 |
| 990.0 | 1.929 |
| 989.0 | 1.757 |
| 988.0 | 1.621 |
| 987.0 | 1.524 |
| 986.0 | 1.458 |
| 985.0 | 1.43 |
| 984.0 | 1.437 |
| 983.0 | 1.482 |
| 982.0 | 1.565 |
| 981.0 | 1.68 |
| 980.0 | 1.831 |
| 979.0 | 2.014 |
| 978.0 | 2.224 |
| 977.0 | 2.459 |
| 976.0 | 2.727 |
| 975.0 | 3.013 |
| 974.0 | 3.304 |
| 973.0 | 3.622 |
| 972.0 | 3.945 |
| 971.0 | 4.263 |
| 970.0 | 4.599 |
| 969.0 | 4.93 |
| 968.0 | 5.245 |
| 967.0 | 5.557 |
| 966.0 | 5.856 |
| 965.0 | 6.128 |
| 964.0 | 6.39 |
| 963.0 | 6.633 |
| 962.0 | 6.836 |
| 961.0 | 7.019 |
| 960.0 | 7.17 |
| 959.0 | 7.288 |
| 958.0 | 7.371 |
| 957.0 | 7.422 |
| 956.0 | 7.434 |
| 955.0 | 7.412 |
| 954.0 | 7.352 |
| 953.0 | 7.256 |
| 952.0 | 7.13 |
| 951.0 | 6.958 |
| 950.0 | 6.756 |
| 949.0 | 6.53 |
| 948.0 | 6.268 |
| 947.0 | 5.978 |
| 946.0 | 5.677 |
| 945.0 | 5.341 |
| 944.0 | 4.983 |
| 943.0 | 4.635 |
| 942.0 | 4.263 |
| 941.0 | 3.89 |
| 940.0 | 3.526 |
| 939.0 | 3.166 |
| 938.0 | 2.806 |
| 937.0 | 2.469 |
| 936.0 | 2.164 |
| 935.0 | 1.869 |
| 934.0 | 1.611 |
| 933.0 | 1.394 |
| 932.0 | 1.204 |
| 931.0 | 1.058 |
| 930.0 | 0.963 |
| 929.0 | 0.909 |
| 928.0 | 0.903 |
| 927.0 | 0.943 |
| 926.0 | 1.033 |
| 925.0 | 1.173 |
| 924.0 | 1.346 |
| 923.0 | 1.568 |
| 922.0 | 1.83 |
| 921.0 | 2.118 |
| 920.0 | 2.436 |
| 919.0 | 2.797 |
| 918.0 | 3.167 |
| 917.0 | 3.54 |
| 916.0 | 3.937 |
| 915.0 | 4.328 |
| 914.0 | 4.71 |
| 913.0 | 5.105 |
| 912.0 | 5.477 |
| 911.0 | 5.817 |
| 910.0 | 6.146 |
| 909.0 | 6.444 |
| 908.0 | 6.7 |
| 907.0 | 6.933 |
| 906.0 | 7.124 |
| 905.0 | 7.264 |
| 904.0 | 7.365 |
| 903.0 | 7.42 |
| 902.0 | 7.426 |
| 901.0 | 7.383 |
| 900.0 | 7.293 |
| 899.0 | 7.156 |
| 898.0 | 6.978 |
| 897.0 | 6.749 |
| 896.0 | 6.485 |
| 895.0 | 6.186 |
| 894.0 | 5.841 |
| 893.0 | 5.471 |
| 892.0 | 5.087 |
| 891.0 | 4.674 |
| 890.0 | 4.252 |
| 889.0 | 3.835 |
| 888.0 | 3.404 |
| 887.0 | 2.976 |
| 886.0 | 2.586 |
| 885.0 | 2.201 |
| 884.0 | 1.854 |
| 883.0 | 1.548 |
| 882.0 | 1.277 |
| 881.0 | 1.054 |
| 880.0 | 0.888 |
| 879.0 | 0.782 |
| 878.0 | 0.731 |
| 877.0 | 0.743 |
| 876.0 | 0.813 |
| 875.0 | 0.95 |
| 874.0 | 1.141 |
| 873.0 | 1.381 |
| 872.0 | 1.678 |
| 871.0 | 2.02 |
| 870.0 | 2.382 |
| 869.0 | 2.797 |
| 868.0 | 3.238 |
| 867.0 | 3.667 |
| 866.0 | 4.123 |
| 865.0 | 4.576 |
| 864.0 | 5.004 |
| 863.0 | 5.428 |
| 862.0 | 5.836 |
| 861.0 | 6.199 |
| 860.0 | 6.524 |
| 859.0 | 6.814 |
| 858.0 | 7.049 |
| 857.0 | 7.23 |
| 856.0 | 7.366 |
| 855.0 | 7.438 |
| 854.0 | 7.452 |
| 853.0 | 7.404 |
| 852.0 | 7.298 |
| 851.0 | 7.144 |
| 850.0 | 6.921 |
| 849.0 | 6.639 |
| 848.0 | 6.332 |
| 847.0 | 5.967 |
| 846.0 | 5.564 |
| 845.0 | 5.146 |
| 844.0 | 4.69 |
| 843.0 | 4.212 |
| 842.0 | 3.745 |
| 841.0 | 3.284 |
| 840.0 | 2.825 |
| 839.0 | 2.399 |
| 838.0 | 2.005 |
| 837.0 | 1.635 |
| 836.0 | 1.331 |
| 835.0 | 1.084 |
| 834.0 | 0.896 |
| 833.0 | 0.773 |
| 832.0 | 0.721 |
| 831.0 | 0.741 |
| 830.0 | 0.833 |
| 829.0 | 0.984 |
| 828.0 | 1.207 |
| 827.0 | 1.484 |
| 826.0 | 1.798 |
| 825.0 | 2.165 |
| 824.0 | 2.575 |
| 823.0 | 2.983 |
| 822.0 | 3.41 |
| 821.0 | 3.844 |
| 820.0 | 4.254 |
| 819.0 | 4.645 |
| 818.0 | 5.02 |
| 817.0 | 5.345 |
| 816.0 | 5.621 |
| 815.0 | 5.847 |
| 814.0 | 6.017 |
| 813.0 | 6.115 |
| 812.0 | 6.156 |
| 811.0 | 6.124 |
| 810.0 | 6.032 |
| 809.0 | 5.865 |
| 808.0 | 5.638 |
| 807.0 | 5.366 |
| 806.0 | 5.024 |
| 805.0 | 4.639 |
| 804.0 | 4.229 |
| 803.0 | 3.791 |
| 802.0 | 3.33 |
| 801.0 | 2.88 |
| 800.0 | 2.439 |
| 799.0 | 1.976 |
| 798.0 | 1.602 |
| 797.0 | 1.267 |
| 796.0 | 0.99 |
| 795.0 | 0.781 |
| 794.0 | 0.66 |
| 793.0 | 0.616 |
| 792.0 | 0.669 |
| 791.0 | 0.801 |
| 790.0 | 1.031 |
| 789.0 | 1.345 |
| 788.0 | 1.714 |
| 787.0 | 2.175 |
| 786.0 | 2.688 |
| 785.0 | 3.224 |
| 784.0 | 3.795 |
| 783.0 | 4.384 |
| 782.0 | 4.944 |
| 781.0 | 5.502 |
| 780.0 | 6.052 |
| 779.0 | 6.529 |
| 778.0 | 6.951 |
| 777.0 | 7.314 |
| 776.0 | 7.606 |
| 775.0 | 7.797 |
| 774.0 | 7.915 |
| 773.0 | 7.941 |
| 772.0 | 7.865 |
| 771.0 | 7.705 |
| 770.0 | 7.453 |
| 769.0 | 7.13 |
| 768.0 | 6.707 |
| 767.0 | 6.221 |
| 766.0 | 5.699 |
| 765.0 | 5.119 |
| 764.0 | 4.511 |
| 763.0 | 3.908 |
| 762.0 | 3.297 |
| 761.0 | 2.691 |
| 760.0 | 2.16 |
| 759.0 | 1.677 |
| 758.0 | 1.263 |
| 757.0 | 0.943 |
| 756.0 | 0.718 |
| 755.0 | 0.592 |
| 754.0 | 0.577 |
| 753.0 | 0.662 |
| 752.0 | 0.857 |
| 751.0 | 1.145 |
| 750.0 | 1.5 |
| 749.0 | 1.939 |
| 748.0 | 2.429 |
| 747.0 | 2.929 |
| 746.0 | 3.454 |
| 745.0 | 3.978 |
| 744.0 | 4.451 |
| 743.0 | 4.895 |
| 742.0 | 5.295 |
| 741.0 | 5.598 |
| 740.0 | 5.825 |
| 739.0 | 5.966 |
| 738.0 | 6.003 |
| 737.0 | 5.952 |
| 736.0 | 5.791 |
| 735.0 | 5.542 |
| 734.0 | 5.216 |
| 733.0 | 4.8 |
| 732.0 | 4.325 |
| 731.0 | 3.823 |
| 730.0 | 3.263 |
| 729.0 | 2.706 |
| 728.0 | 2.183 |
| 727.0 | 1.678 |
| 726.0 | 1.231 |
| 725.0 | 0.875 |
| 724.0 | 0.6 |
| 723.0 | 0.435 |
| 722.0 | 0.389 |
| 721.0 | 0.457 |
| 720.0 | 0.642 |
| 719.0 | 0.907 |
| 718.0 | 1.308 |
| 717.0 | 1.776 |
| 716.0 | 2.305 |
| 715.0 | 2.868 |
| 714.0 | 3.437 |
| 713.0 | 3.991 |
| 712.0 | 4.506 |
| 711.0 | 4.961 |
| 710.0 | 5.336 |
| 709.0 | 5.61 |
| 708.0 | 5.79 |
| 707.0 | 5.85 |
| 706.0 | 5.795 |
| 705.0 | 5.62 |
| 704.0 | 5.334 |
| 703.0 | 4.943 |
| 702.0 | 4.47 |
| 701.0 | 3.929 |
| 700.0 | 3.341 |
| 699.0 | 2.73 |
| 698.0 | 2.142 |
| 697.0 | 1.588 |
| 696.0 | 1.107 |
| 695.0 | 0.728 |
| 694.0 | 0.479 |
| 693.0 | 0.366 |
| 692.0 | 0.408 |
| 691.0 | 0.611 |
| 690.0 | 0.958 |
| 689.0 | 1.452 |
| 688.0 | 2.069 |
| 687.0 | 2.769 |
| 686.0 | 3.535 |
| 685.0 | 4.334 |
| 684.0 | 5.116 |
| 683.0 | 5.858 |
| 682.0 | 6.523 |
| 681.0 | 7.098 |
| 680.0 | 7.545 |
| 679.0 | 7.845 |
| 678.0 | 7.994 |
| 677.0 | 7.982 |
| 676.0 | 7.804 |
| 675.0 | 7.471 |
| 674.0 | 6.997 |
| 673.0 | 6.387 |
| 672.0 | 5.675 |
| 671.0 | 4.905 |
| 670.0 | 4.085 |
| 669.0 | 3.264 |
| 668.0 | 2.488 |
| 667.0 | 1.792 |
| 666.0 | 1.207 |
| 665.0 | 0.767 |
| 664.0 | 0.5 |
| 663.0 | 0.415 |
| 662.0 | 0.508 |
| 661.0 | 0.776 |
| 660.0 | 1.19 |
| 659.0 | 1.723 |
| 658.0 | 2.344 |
| 657.0 | 3.006 |
| 656.0 | 3.67 |
| 655.0 | 4.286 |
| 654.0 | 4.833 |
| 653.0 | 5.273 |
| 652.0 | 5.573 |
| 651.0 | 5.727 |
| 650.0 | 5.724 |
| 649.0 | 5.563 |
| 648.0 | 5.253 |
| 647.0 | 4.815 |
| 646.0 | 4.264 |
| 645.0 | 3.644 |
| 644.0 | 2.991 |
| 643.0 | 2.336 |
| 642.0 | 1.734 |
| 641.0 | 1.219 |
| 640.0 | 0.834 |
| 639.0 | 0.602 |
| 638.0 | 0.535 |
| 637.0 | 0.642 |
| 636.0 | 0.909 |
| 635.0 | 1.315 |
| 634.0 | 1.825 |
| 633.0 | 2.392 |
| 632.0 | 2.976 |
| 631.0 | 3.535 |
| 630.0 | 4.019 |
| 629.0 | 4.398 |
| 628.0 | 4.633 |
| 627.0 | 4.716 |
| 626.0 | 4.637 |
| 625.0 | 4.406 |
| 624.0 | 4.033 |
| 623.0 | 3.553 |
| 622.0 | 2.997 |
| 621.0 | 2.423 |
| 620.0 | 1.886 |
| 619.0 | 1.433 |
| 618.0 | 1.119 |
| 617.0 | 0.996 |
| 616.0 | 1.081 |
| 615.0 | 1.397 |
| 614.0 | 1.924 |
| 613.0 | 2.639 |
| 612.0 | 3.496 |
| 611.0 | 4.452 |
| 610.0 | 5.43 |
| 609.0 | 6.365 |
| 608.0 | 7.214 |
| 607.0 | 7.907 |
| 606.0 | 8.413 |
| 605.0 | 8.697 |
| 604.0 | 8.746 |
| 603.0 | 8.556 |
| 602.0 | 8.136 |
| 601.0 | 7.522 |
| 600.0 | 6.738 |
| 599.0 | 5.834 |
| 598.0 | 4.905 |
| 597.0 | 3.988 |
| 596.0 | 3.168 |
| 595.0 | 2.503 |
| 594.0 | 2.049 |
| 593.0 | 1.83 |
| 592.0 | 1.855 |
| 591.0 | 2.092 |
| 590.0 | 2.511 |
| 589.0 | 3.05 |
| 588.0 | 3.634 |
| 587.0 | 4.193 |
| 586.0 | 4.662 |
| 585.0 | 4.991 |
| 584.0 | 5.146 |
| 583.0 | 5.103 |
| 582.0 | 4.872 |
| 581.0 | 4.498 |
| 580.0 | 4.004 |
| 579.0 | 3.484 |
| 578.0 | 2.998 |
| 577.0 | 2.631 |
| 576.0 | 2.456 |
| 575.0 | 2.53 |
| 574.0 | 2.864 |
| 573.0 | 3.479 |
| 572.0 | 4.316 |
| 571.0 | 5.309 |
| 570.0 | 6.377 |
| 569.0 | 7.435 |
| 568.0 | 8.395 |
| 567.0 | 9.141 |
| 566.0 | 9.627 |
| 565.0 | 9.826 |
| 564.0 | 9.711 |
| 563.0 | 9.321 |
| 562.0 | 8.677 |
| 561.0 | 7.864 |
| 560.0 | 6.986 |
| 559.0 | 6.146 |
| 558.0 | 5.454 |
| 557.0 | 5.002 |
| 556.0 | 4.878 |
| 555.0 | 5.097 |
| 554.0 | 5.658 |
| 553.0 | 6.497 |
| 552.0 | 7.51 |
| 551.0 | 8.595 |
| 550.0 | 9.616 |
| 549.0 | 10.489 |
| 548.0 | 11.101 |
| 547.0 | 11.396 |
| 546.0 | 11.343 |
| 545.0 | 10.959 |
| 544.0 | 10.27 |
| 543.0 | 9.354 |
| 542.0 | 8.272 |
| 541.0 | 7.139 |
| 540.0 | 6.051 |
| 539.0 | 5.088 |
| 538.0 | 4.285 |
| 537.0 | 3.682 |
| 536.0 | 3.266 |
| 535.0 | 2.987 |
| 534.0 | 2.812 |
| 533.0 | 2.675 |
| 532.0 | 2.547 |
| 531.0 | 2.416 |
| 530.0 | 2.316 |
| 529.0 | 2.307 |
| 528.0 | 2.455 |
| 527.0 | 2.851 |
| 526.0 | 3.544 |
| 525.0 | 4.546 |
| 524.0 | 5.838 |
| 523.0 | 7.342 |
| 522.0 | 8.929 |
| 521.0 | 10.468 |
| 520.0 | 11.809 |
| 519.0 | 12.902 |
| 518.0 | 13.689 |
| 517.0 | 14.18 |
| 516.0 | 14.466 |
| 515.0 | 14.71 |
| 514.0 | 15.065 |
| 513.0 | 15.713 |
| 512.0 | 16.761 |
| 511.0 | 18.276 |
| 510.0 | 20.188 |
| 509.0 | 22.298 |
| 508.0 | 24.421 |
| 507.0 | 26.329 |
| 506.0 | 27.773 |
| 505.0 | 28.607 |
| 504.0 | 28.752 |
| 503.0 | 28.228 |
| 502.0 | 27.175 |
| 501.0 | 25.845 |
| 500.0 | 24.515 |
| 499.0 | 23.51 |
| 498.0 | 23.072 |
| 497.0 | 23.301 |
| 496.0 | 24.141 |
| 495.0 | 25.482 |
| 494.0 | 27.201 |
| 493.0 | 29.31 |
| 492.0 | 32.124 |
| 491.0 | 36.019 |
| 490.0 | 41.224 |
| 489.0 | 47.794 |
| 488.0 | 55.407 |
| 487.0 | 63.323 |
| 486.0 | 70.693 |
| 485.0 | 76.969 |
| 484.0 | 82.028 |
| 483.0 | 85.793 |
| 482.0 | 88.471 |
| 481.0 | 90.388 |
| 480.0 | 91.701 |
| 479.0 | 92.672 |
| 478.0 | 93.363 |
| 477.0 | 93.96 |
| 476.0 | 94.475 |
| 475.0 | 94.997 |
| 474.0 | 95.529 |
| 473.0 | 96.073 |
| 472.0 | 96.593 |
| 471.0 | 97.059 |
| 470.0 | 97.468 |
| 469.0 | 97.793 |
| 468.0 | 98.043 |
| 467.0 | 98.231 |
| 466.0 | 98.399 |
| 465.0 | 98.507 |
| 464.0 | 98.618 |
| 463.0 | 98.732 |
| 462.0 | 98.836 |
| 461.0 | 98.967 |
| 460.0 | 99.055 |
| 459.0 | 99.16 |
| 458.0 | 99.233 |
| 457.0 | 99.313 |
| 456.0 | 99.354 |
| 455.0 | 99.363 |
| 454.0 | 99.386 |
| 453.0 | 99.347 |
| 452.0 | 99.291 |
| 451.0 | 99.24 |
| 450.0 | 99.193 |
| 449.0 | 99.189 |
| 448.0 | 99.246 |
| 447.0 | 99.281 |
| 446.0 | 99.395 |
| 445.0 | 99.484 |
| 444.0 | 99.522 |
| 443.0 | 99.59 |
| 442.0 | 99.563 |
| 441.0 | 99.573 |
| 440.0 | 99.58 |
| 439.0 | 99.533 |
| 438.0 | 99.5 |
| 437.0 | 99.485 |
| 436.0 | 99.458 |
| 435.0 | 99.476 |
| 434.0 | 99.464 |
| 433.0 | 99.453 |
| 432.0 | 99.479 |
| 431.0 | 99.535 |
| 430.0 | 99.525 |
| 429.0 | 99.592 |
| 428.0 | 99.57 |
| 427.0 | 99.565 |
| 426.0 | 99.601 |
| 425.0 | 99.542 |
| 424.0 | 99.541 |
| 423.0 | 99.48 |
| 422.0 | 99.476 |
| 421.0 | 99.409 |
| 420.0 | 99.363 |
| 419.0 | 99.392 |
| 418.0 | 99.37 |
| 417.0 | 99.447 |
| 416.0 | 99.435 |
| 415.0 | 99.518 |
| 414.0 | 99.546 |
| 413.0 | 99.586 |
| 412.0 | 99.642 |
| 411.0 | 99.645 |
| 410.0 | 99.659 |
| 409.0 | 99.674 |
| 408.0 | 99.616 |
| 407.0 | 99.633 |
| 406.0 | 99.583 |
| 405.0 | 99.558 |
| 404.0 | 99.467 |
| 403.0 | 99.378 |
| 402.0 | 99.254 |
| 401.0 | 99.078 |
| 400.0 | 98.935 |
| 399.0 | 98.889 |
| 398.0 | 98.991 |
| 397.0 | 99.141 |
| 396.0 | 99.399 |
| 395.0 | 99.421 |
| 394.0 | 99.648 |
| 393.0 | 99.672 |
| 392.0 | 99.702 |
| 391.0 | 99.662 |
| 390.0 | 99.723 |
| 389.0 | 99.606 |
| 388.0 | 99.677 |
| 387.0 | 99.696 |
| 386.0 | 99.689 |
| 385.0 | 99.723 |
| 384.0 | 99.69 |
| 383.0 | 99.662 |
| 382.0 | 99.701 |
| 381.0 | 99.721 |
| 380.0 | 99.621 |
| 379.0 | 99.623 |
| 378.0 | 99.613 |
| 377.0 | 99.533 |
| 376.0 | 99.624 |
| 375.0 | 99.717 |
| 374.0 | 99.687 |
| 373.0 | 99.474 |
| 372.0 | 99.457 |
| 371.0 | 99.606 |
| 370.0 | 99.449 |
| 369.0 | 99.567 |
| 368.0 | 99.504 |
| 367.0 | 99.447 |
| 366.0 | 99.529 |
| 365.0 | 99.411 |
| 364.0 | 99.399 |
| 363.0 | 99.46 |
| 362.0 | 99.639 |
| 361.0 | 99.466 |
| 360.0 | 99.383 |
| 359.0 | 99.44 |
| 358.0 | 99.252 |
| 357.0 | 99.546 |
| 356.0 | 99.239 |
| 355.0 | 99.438 |
| 354.0 | 99.311 |
| 353.0 | 99.328 |
| 352.0 | 99.58 |
| 351.0 | 99.554 |
| 350.0 | 99.276 |
| 349.0 | 99.281 |
| 348.0 | 99.32 |
| 347.0 | 99.249 |
| 346.0 | 99.033 |
| 345.0 | 99.078 |
| 344.0 | 99.254 |
| 343.0 | 99.166 |
| 342.0 | 99.012 |
| 341.0 | 99.028 |
| 340.0 | 98.959 |
| 339.0 | 98.765 |
| 338.0 | 98.961 |
| 337.0 | 98.91 |
| 336.0 | 98.614 |
| 335.0 | 98.608 |
| 334.0 | 98.462 |
| 333.0 | 98.283 |
| 332.0 | 97.714 |
| 331.0 | 97.511 |
| 330.0 | 96.933 |
| 329.0 | 96.44 |
| 328.0 | 95.406 |
| 327.0 | 94.119 |
| 326.0 | 92.429 |
| 325.0 | 90.805 |
| 324.0 | 87.565 |
| 323.0 | 84.556 |
| 322.0 | 81.064 |
| 321.0 | 76.761 |
| 320.0 | 73.812 |
| 319.0 | 69.617 |
| 318.0 | 66.276 |
| 317.0 | 60.04 |
| 316.0 | 50.902 |
| 315.0 | 39.186 |
| 314.0 | 27.437 |
| 313.0 | 17.871 |
| 312.0 | 11.28 |
| 311.0 | 8.039 |
| 310.0 | 7.565 |
| 309.0 | 8.575 |
| 308.0 | 10.61 |
| 307.0 | 13.397 |
| 306.0 | 16.536 |
| 305.0 | 19.608 |
| 304.0 | 21.63 |
| 303.0 | 21.079 |
| 302.0 | 18.188 |
| 301.0 | 13.955 |
| 300.0 | 10.151 |
| 299.0 | 7.519 |
| 298.0 | 5.958 |
| 297.0 | 4.794 |
| 296.0 | 4.279 |
| 295.0 | 3.454 |
| 294.0 | 3.124 |
| 293.0 | 2.733 |
| 292.0 | 2.078 |
| 291.0 | 1.759 |
| 290.0 | 1.803 |
| 289.0 | 1.855 |
| 288.0 | 2.269 |
| 287.0 | 2.385 |
| 286.0 | 2.227 |
| 285.0 | 1.987 |
| 284.0 | 1.847 |
| 283.0 | 1.571 |
| 282.0 | 1.533 |
| 281.0 | 1.329 |
| 280.0 | 1.218 |
| 279.0 | 1.016 |
| 278.0 | 1.363 |
| 277.0 | 1.435 |
| 276.0 | 1.545 |
| 275.0 | 1.374 |
| 274.0 | 1.037 |
| 273.0 | 0.851 |
| 272.0 | 0.898 |
| 271.0 | 1.069 |
| 270.0 | 1.365 |
| 269.0 | 1.564 |
| 268.0 | 1.511 |
| 267.0 | 1.395 |
| 266.0 | 1.312 |
| 265.0 | 1.088 |
| 264.0 | 1.023 |
| 263.0 | 0.934 |
| 262.0 | 1.105 |
| 261.0 | 1.456 |
| 260.0 | 2 |
| 259.0 | 2.543 |
| 258.0 | 2.727 |
| 257.0 | 2.606 |
| 256.0 | 2.412 |
| 255.0 | 2.243 |
| 254.0 | 1.912 |
| 253.0 | 1.715 |
| 252.0 | 1.572 |
| 251.0 | 1.64 |
| 250.0 | 1.867 |